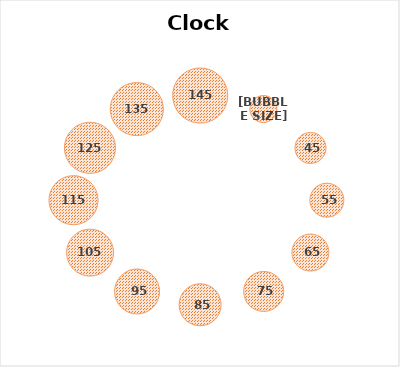
| Category | Y |
|---|---|
| 150.0 | 87 |
| 187.0 | 50 |
| 200.0 | 0 |
| 187.0 | -50 |
| 150.0 | -87 |
| 100.0 | -100 |
| 50.0 | -87 |
| 13.0 | -50 |
| 0.0 | 0 |
| 13.0 | 50 |
| 50.0 | 87 |
| 100.0 | 100 |